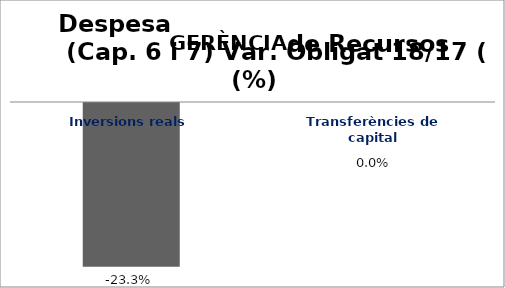
| Category | Series 0 |
|---|---|
| Inversions reals | -0.233 |
| Transferències de capital | 0 |